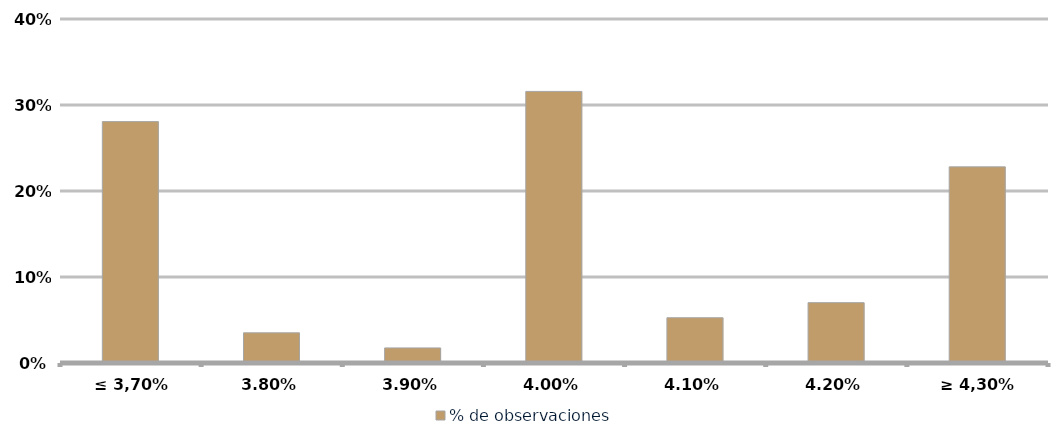
| Category | % de observaciones  |
|---|---|
| ≤ 3,70% | 0.281 |
| 3,80% | 0.035 |
| 3,90% | 0.018 |
| 4,00% | 0.316 |
| 4,10% | 0.053 |
| 4,20% | 0.07 |
| ≥ 4,30% | 0.228 |